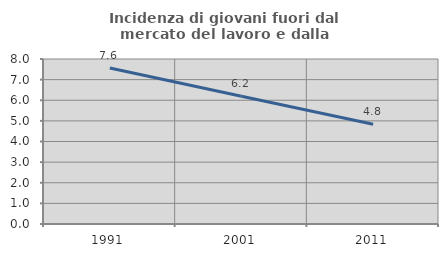
| Category | Incidenza di giovani fuori dal mercato del lavoro e dalla formazione  |
|---|---|
| 1991.0 | 7.563 |
| 2001.0 | 6.195 |
| 2011.0 | 4.839 |